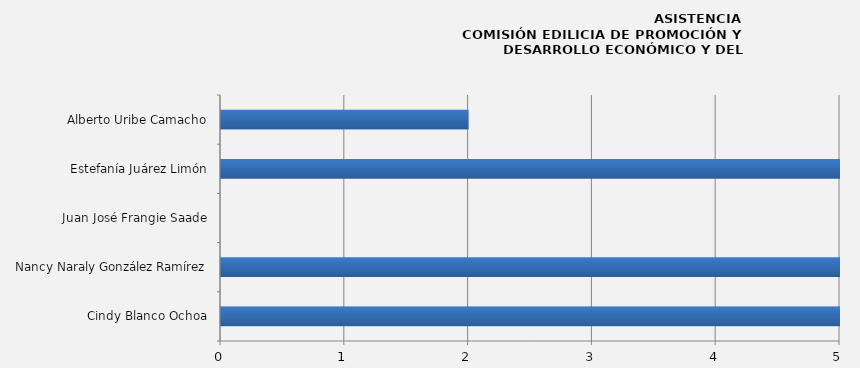
| Category | Series 0 |
|---|---|
| Cindy Blanco Ochoa | 5 |
| Nancy Naraly González Ramírez | 5 |
| Juan José Frangie Saade | 0 |
| Estefanía Juárez Limón | 5 |
| Alberto Uribe Camacho | 2 |